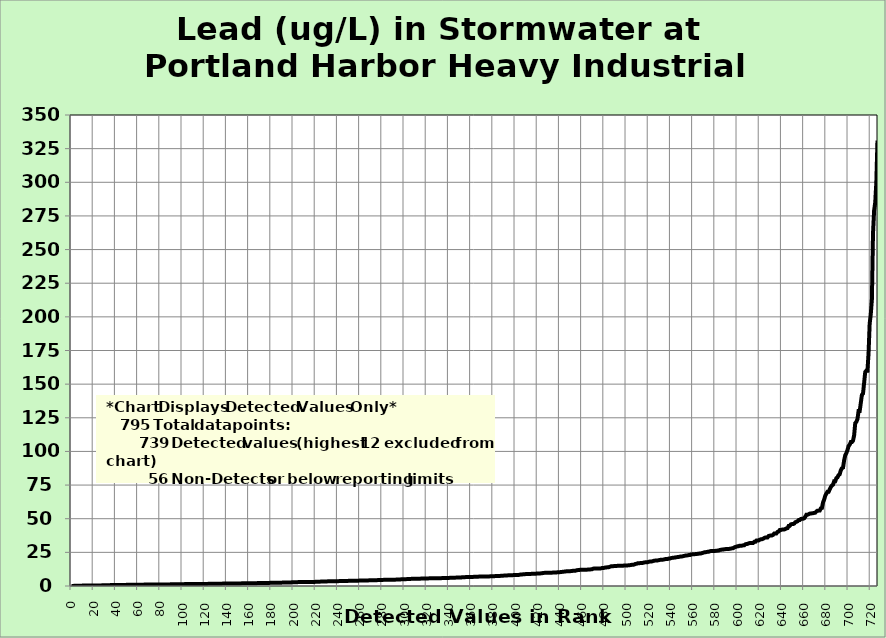
| Category | Lead |
|---|---|
| 0.0 | 0.011 |
| 1.0 | 0.014 |
| 2.0 | 0.115 |
| 3.0 | 0.137 |
| 4.0 | 0.178 |
| 5.0 | 0.24 |
| 6.0 | 0.246 |
| 7.0 | 0.25 |
| 8.0 | 0.256 |
| 9.0 | 0.256 |
| 10.0 | 0.3 |
| 11.0 | 0.31 |
| 12.0 | 0.339 |
| 13.0 | 0.34 |
| 14.0 | 0.341 |
| 15.0 | 0.358 |
| 16.0 | 0.374 |
| 17.0 | 0.397 |
| 18.0 | 0.4 |
| 19.0 | 0.41 |
| 20.0 | 0.41 |
| 21.0 | 0.422 |
| 22.0 | 0.43 |
| 23.0 | 0.433 |
| 24.0 | 0.444 |
| 25.0 | 0.452 |
| 26.0 | 0.456 |
| 27.0 | 0.464 |
| 28.0 | 0.488 |
| 29.0 | 0.49 |
| 30.0 | 0.52 |
| 31.0 | 0.528 |
| 32.0 | 0.533 |
| 33.0 | 0.611 |
| 34.0 | 0.616 |
| 35.0 | 0.66 |
| 36.0 | 0.678 |
| 37.0 | 0.678 |
| 38.0 | 0.682 |
| 39.0 | 0.71 |
| 40.0 | 0.72 |
| 41.0 | 0.721 |
| 42.0 | 0.73 |
| 43.0 | 0.744 |
| 44.0 | 0.756 |
| 45.0 | 0.767 |
| 46.0 | 0.774 |
| 47.0 | 0.81 |
| 48.0 | 0.81 |
| 49.0 | 0.833 |
| 50.0 | 0.867 |
| 51.0 | 0.878 |
| 52.0 | 0.89 |
| 53.0 | 0.9 |
| 54.0 | 0.9 |
| 55.0 | 0.9 |
| 56.0 | 0.932 |
| 57.0 | 0.933 |
| 58.0 | 0.967 |
| 59.0 | 0.971 |
| 60.0 | 0.98 |
| 61.0 | 0.99 |
| 62.0 | 0.992 |
| 63.0 | 1.01 |
| 64.0 | 1.02 |
| 65.0 | 1.02 |
| 66.0 | 1.05 |
| 67.0 | 1.05 |
| 68.0 | 1.07 |
| 69.0 | 1.08 |
| 70.0 | 1.08 |
| 71.0 | 1.08 |
| 72.0 | 1.08 |
| 73.0 | 1.08 |
| 74.0 | 1.08 |
| 75.0 | 1.1 |
| 76.0 | 1.12 |
| 77.0 | 1.13 |
| 78.0 | 1.13 |
| 79.0 | 1.14 |
| 80.0 | 1.16 |
| 81.0 | 1.2 |
| 82.0 | 1.2 |
| 83.0 | 1.2 |
| 84.0 | 1.2 |
| 85.0 | 1.2 |
| 86.0 | 1.2 |
| 87.0 | 1.2 |
| 88.0 | 1.2 |
| 89.0 | 1.21 |
| 90.0 | 1.22 |
| 91.0 | 1.24 |
| 92.0 | 1.25 |
| 93.0 | 1.27 |
| 94.0 | 1.29 |
| 95.0 | 1.3 |
| 96.0 | 1.3 |
| 97.0 | 1.33 |
| 98.0 | 1.34 |
| 99.0 | 1.34 |
| 100.0 | 1.38 |
| 101.0 | 1.38 |
| 102.0 | 1.4 |
| 103.0 | 1.4 |
| 104.0 | 1.4 |
| 105.0 | 1.41 |
| 106.0 | 1.42 |
| 107.0 | 1.42 |
| 108.0 | 1.42 |
| 109.0 | 1.44 |
| 110.0 | 1.44 |
| 111.0 | 1.46 |
| 112.0 | 1.49 |
| 113.0 | 1.5 |
| 114.0 | 1.5 |
| 115.0 | 1.5 |
| 116.0 | 1.5 |
| 117.0 | 1.52 |
| 118.0 | 1.53 |
| 119.0 | 1.53 |
| 120.0 | 1.56 |
| 121.0 | 1.57 |
| 122.0 | 1.57 |
| 123.0 | 1.58 |
| 124.0 | 1.58 |
| 125.0 | 1.6 |
| 126.0 | 1.6 |
| 127.0 | 1.6 |
| 128.0 | 1.65 |
| 129.0 | 1.67 |
| 130.0 | 1.67 |
| 131.0 | 1.7 |
| 132.0 | 1.7 |
| 133.0 | 1.7 |
| 134.0 | 1.72 |
| 135.0 | 1.73 |
| 136.0 | 1.77 |
| 137.0 | 1.78 |
| 138.0 | 1.78 |
| 139.0 | 1.8 |
| 140.0 | 1.82 |
| 141.0 | 1.82 |
| 142.0 | 1.83 |
| 143.0 | 1.84 |
| 144.0 | 1.87 |
| 145.0 | 1.87 |
| 146.0 | 1.88 |
| 147.0 | 1.89 |
| 148.0 | 1.9 |
| 149.0 | 1.9 |
| 150.0 | 1.9 |
| 151.0 | 1.9 |
| 152.0 | 1.9 |
| 153.0 | 1.95 |
| 154.0 | 1.96 |
| 155.0 | 1.97 |
| 156.0 | 1.97 |
| 157.0 | 2 |
| 158.0 | 2 |
| 159.0 | 2 |
| 160.0 | 2 |
| 161.0 | 2.04 |
| 162.0 | 2.08 |
| 163.0 | 2.08 |
| 164.0 | 2.1 |
| 165.0 | 2.11 |
| 166.0 | 2.12 |
| 167.0 | 2.13 |
| 168.0 | 2.16 |
| 169.0 | 2.2 |
| 170.0 | 2.2 |
| 171.0 | 2.2 |
| 172.0 | 2.21 |
| 173.0 | 2.23 |
| 174.0 | 2.26 |
| 175.0 | 2.26 |
| 176.0 | 2.3 |
| 177.0 | 2.3 |
| 178.0 | 2.31 |
| 179.0 | 2.33 |
| 180.0 | 2.33 |
| 181.0 | 2.33 |
| 182.0 | 2.34 |
| 183.0 | 2.4 |
| 184.0 | 2.4 |
| 185.0 | 2.4 |
| 186.0 | 2.42 |
| 187.0 | 2.49 |
| 188.0 | 2.5 |
| 189.0 | 2.5 |
| 190.0 | 2.51 |
| 191.0 | 2.52 |
| 192.0 | 2.55 |
| 193.0 | 2.56 |
| 194.0 | 2.56 |
| 195.0 | 2.59 |
| 196.0 | 2.6 |
| 197.0 | 2.6 |
| 198.0 | 2.69 |
| 199.0 | 2.78 |
| 200.0 | 2.78 |
| 201.0 | 2.79 |
| 202.0 | 2.8 |
| 203.0 | 2.8 |
| 204.0 | 2.89 |
| 205.0 | 2.9 |
| 206.0 | 2.9 |
| 207.0 | 2.9 |
| 208.0 | 2.91 |
| 209.0 | 2.93 |
| 210.0 | 2.94 |
| 211.0 | 2.96 |
| 212.0 | 2.96 |
| 213.0 | 2.97 |
| 214.0 | 2.98 |
| 215.0 | 2.99 |
| 216.0 | 2.99 |
| 217.0 | 3 |
| 218.0 | 3 |
| 219.0 | 3.01 |
| 220.0 | 3.18 |
| 221.0 | 3.2 |
| 222.0 | 3.2 |
| 223.0 | 3.24 |
| 224.0 | 3.24 |
| 225.0 | 3.29 |
| 226.0 | 3.36 |
| 227.0 | 3.36 |
| 228.0 | 3.39 |
| 229.0 | 3.4 |
| 230.0 | 3.42 |
| 231.0 | 3.45 |
| 232.0 | 3.46 |
| 233.0 | 3.47 |
| 234.0 | 3.5 |
| 235.0 | 3.5 |
| 236.0 | 3.5 |
| 237.0 | 3.54 |
| 238.0 | 3.57 |
| 239.0 | 3.57 |
| 240.0 | 3.6 |
| 241.0 | 3.63 |
| 242.0 | 3.7 |
| 243.0 | 3.71 |
| 244.0 | 3.72 |
| 245.0 | 3.73 |
| 246.0 | 3.74 |
| 247.0 | 3.74 |
| 248.0 | 3.8 |
| 249.0 | 3.8 |
| 250.0 | 3.87 |
| 251.0 | 3.88 |
| 252.0 | 3.9 |
| 253.0 | 3.9 |
| 254.0 | 3.9 |
| 255.0 | 3.9 |
| 256.0 | 3.93 |
| 257.0 | 3.96 |
| 258.0 | 3.97 |
| 259.0 | 4 |
| 260.0 | 4 |
| 261.0 | 4.02 |
| 262.0 | 4.05 |
| 263.0 | 4.06 |
| 264.0 | 4.1 |
| 265.0 | 4.1 |
| 266.0 | 4.11 |
| 267.0 | 4.14 |
| 268.0 | 4.2 |
| 269.0 | 4.25 |
| 270.0 | 4.26 |
| 271.0 | 4.26 |
| 272.0 | 4.3 |
| 273.0 | 4.31 |
| 274.0 | 4.33 |
| 275.0 | 4.35 |
| 276.0 | 4.38 |
| 277.0 | 4.38 |
| 278.0 | 4.4 |
| 279.0 | 4.43 |
| 280.0 | 4.5 |
| 281.0 | 4.56 |
| 282.0 | 4.57 |
| 283.0 | 4.58 |
| 284.0 | 4.6 |
| 285.0 | 4.6 |
| 286.0 | 4.6 |
| 287.0 | 4.65 |
| 288.0 | 4.66 |
| 289.0 | 4.68 |
| 290.0 | 4.68 |
| 291.0 | 4.69 |
| 292.0 | 4.73 |
| 293.0 | 4.8 |
| 294.0 | 4.8 |
| 295.0 | 4.83 |
| 296.0 | 4.85 |
| 297.0 | 4.98 |
| 298.0 | 5 |
| 299.0 | 5.03 |
| 300.0 | 5.07 |
| 301.0 | 5.1 |
| 302.0 | 5.11 |
| 303.0 | 5.2 |
| 304.0 | 5.22 |
| 305.0 | 5.26 |
| 306.0 | 5.3 |
| 307.0 | 5.31 |
| 308.0 | 5.38 |
| 309.0 | 5.38 |
| 310.0 | 5.4 |
| 311.0 | 5.4 |
| 312.0 | 5.4 |
| 313.0 | 5.41 |
| 314.0 | 5.44 |
| 315.0 | 5.51 |
| 316.0 | 5.55 |
| 317.0 | 5.58 |
| 318.0 | 5.6 |
| 319.0 | 5.6 |
| 320.0 | 5.62 |
| 321.0 | 5.64 |
| 322.0 | 5.67 |
| 323.0 | 5.7 |
| 324.0 | 5.7 |
| 325.0 | 5.7 |
| 326.0 | 5.7 |
| 327.0 | 5.71 |
| 328.0 | 5.74 |
| 329.0 | 5.8 |
| 330.0 | 5.8 |
| 331.0 | 5.81 |
| 332.0 | 5.83 |
| 333.0 | 5.83 |
| 334.0 | 5.89 |
| 335.0 | 5.9 |
| 336.0 | 5.93 |
| 337.0 | 5.93 |
| 338.0 | 5.93 |
| 339.0 | 5.96 |
| 340.0 | 6 |
| 341.0 | 6.1 |
| 342.0 | 6.11 |
| 343.0 | 6.13 |
| 344.0 | 6.15 |
| 345.0 | 6.19 |
| 346.0 | 6.22 |
| 347.0 | 6.26 |
| 348.0 | 6.27 |
| 349.0 | 6.29 |
| 350.0 | 6.29 |
| 351.0 | 6.3 |
| 352.0 | 6.56 |
| 353.0 | 6.56 |
| 354.0 | 6.57 |
| 355.0 | 6.6 |
| 356.0 | 6.6 |
| 357.0 | 6.6 |
| 358.0 | 6.6 |
| 359.0 | 6.66 |
| 360.0 | 6.66 |
| 361.0 | 6.7 |
| 362.0 | 6.78 |
| 363.0 | 6.8 |
| 364.0 | 6.87 |
| 365.0 | 6.9 |
| 366.0 | 6.92 |
| 367.0 | 6.99 |
| 368.0 | 6.99 |
| 369.0 | 7 |
| 370.0 | 7 |
| 371.0 | 7.01 |
| 372.0 | 7.01 |
| 373.0 | 7.02 |
| 374.0 | 7.02 |
| 375.0 | 7.03 |
| 376.0 | 7.05 |
| 377.0 | 7.22 |
| 378.0 | 7.26 |
| 379.0 | 7.26 |
| 380.0 | 7.28 |
| 381.0 | 7.3 |
| 382.0 | 7.4 |
| 383.0 | 7.43 |
| 384.0 | 7.43 |
| 385.0 | 7.49 |
| 386.0 | 7.5 |
| 387.0 | 7.6 |
| 388.0 | 7.62 |
| 389.0 | 7.68 |
| 390.0 | 7.79 |
| 391.0 | 7.8 |
| 392.0 | 7.86 |
| 393.0 | 7.9 |
| 394.0 | 7.99 |
| 395.0 | 8 |
| 396.0 | 8.01 |
| 397.0 | 8.04 |
| 398.0 | 8.1 |
| 399.0 | 8.1 |
| 400.0 | 8.13 |
| 401.0 | 8.2 |
| 402.0 | 8.2 |
| 403.0 | 8.23 |
| 404.0 | 8.47 |
| 405.0 | 8.6 |
| 406.0 | 8.6 |
| 407.0 | 8.7 |
| 408.0 | 8.72 |
| 409.0 | 8.84 |
| 410.0 | 8.96 |
| 411.0 | 9 |
| 412.0 | 9 |
| 413.0 | 9 |
| 414.0 | 9 |
| 415.0 | 9.08 |
| 416.0 | 9.1 |
| 417.0 | 9.1 |
| 418.0 | 9.1 |
| 419.0 | 9.26 |
| 420.0 | 9.27 |
| 421.0 | 9.34 |
| 422.0 | 9.35 |
| 423.0 | 9.4 |
| 424.0 | 9.5 |
| 425.0 | 9.73 |
| 426.0 | 9.76 |
| 427.0 | 9.8 |
| 428.0 | 9.8 |
| 429.0 | 9.8 |
| 430.0 | 9.9 |
| 431.0 | 9.9 |
| 432.0 | 9.93 |
| 433.0 | 9.93 |
| 434.0 | 10 |
| 435.0 | 10 |
| 436.0 | 10.1 |
| 437.0 | 10.1 |
| 438.0 | 10.2 |
| 439.0 | 10.3 |
| 440.0 | 10.3 |
| 441.0 | 10.4 |
| 442.0 | 10.5 |
| 443.0 | 10.6 |
| 444.0 | 10.7 |
| 445.0 | 10.8 |
| 446.0 | 11 |
| 447.0 | 11 |
| 448.0 | 11 |
| 449.0 | 11 |
| 450.0 | 11.1 |
| 451.0 | 11.2 |
| 452.0 | 11.4 |
| 453.0 | 11.4 |
| 454.0 | 11.4 |
| 455.0 | 11.7 |
| 456.0 | 11.8 |
| 457.0 | 11.8 |
| 458.0 | 12 |
| 459.0 | 12 |
| 460.0 | 12 |
| 461.0 | 12 |
| 462.0 | 12.1 |
| 463.0 | 12.1 |
| 464.0 | 12.1 |
| 465.0 | 12.2 |
| 466.0 | 12.2 |
| 467.0 | 12.3 |
| 468.0 | 12.4 |
| 469.0 | 12.5 |
| 470.0 | 12.9 |
| 471.0 | 13 |
| 472.0 | 13 |
| 473.0 | 13 |
| 474.0 | 13 |
| 475.0 | 13 |
| 476.0 | 13 |
| 477.0 | 13.1 |
| 478.0 | 13.4 |
| 479.0 | 13.4 |
| 480.0 | 13.5 |
| 481.0 | 13.8 |
| 482.0 | 13.8 |
| 483.0 | 14 |
| 484.0 | 14 |
| 485.0 | 14.3 |
| 486.0 | 14.6 |
| 487.0 | 14.6 |
| 488.0 | 14.7 |
| 489.0 | 14.9 |
| 490.0 | 14.9 |
| 491.0 | 14.9 |
| 492.0 | 15 |
| 493.0 | 15 |
| 494.0 | 15 |
| 495.0 | 15 |
| 496.0 | 15 |
| 497.0 | 15.1 |
| 498.0 | 15.3 |
| 499.0 | 15.3 |
| 500.0 | 15.3 |
| 501.0 | 15.3 |
| 502.0 | 15.4 |
| 503.0 | 15.5 |
| 504.0 | 15.6 |
| 505.0 | 15.8 |
| 506.0 | 15.8 |
| 507.0 | 16 |
| 508.0 | 16.4 |
| 509.0 | 16.5 |
| 510.0 | 16.9 |
| 511.0 | 16.9 |
| 512.0 | 17 |
| 513.0 | 17 |
| 514.0 | 17 |
| 515.0 | 17.3 |
| 516.0 | 17.5 |
| 517.0 | 17.6 |
| 518.0 | 17.7 |
| 519.0 | 17.7 |
| 520.0 | 18 |
| 521.0 | 18.2 |
| 522.0 | 18.2 |
| 523.0 | 18.3 |
| 524.0 | 18.6 |
| 525.0 | 18.8 |
| 526.0 | 18.9 |
| 527.0 | 19 |
| 528.0 | 19 |
| 529.0 | 19.2 |
| 530.0 | 19.4 |
| 531.0 | 19.5 |
| 532.0 | 19.5 |
| 533.0 | 19.6 |
| 534.0 | 19.8 |
| 535.0 | 20 |
| 536.0 | 20 |
| 537.0 | 20.1 |
| 538.0 | 20.4 |
| 539.0 | 20.4 |
| 540.0 | 20.7 |
| 541.0 | 20.9 |
| 542.0 | 21 |
| 543.0 | 21.1 |
| 544.0 | 21.2 |
| 545.0 | 21.4 |
| 546.0 | 21.5 |
| 547.0 | 21.6 |
| 548.0 | 21.8 |
| 549.0 | 22 |
| 550.0 | 22 |
| 551.0 | 22.2 |
| 552.0 | 22.4 |
| 553.0 | 22.6 |
| 554.0 | 22.6 |
| 555.0 | 22.8 |
| 556.0 | 23 |
| 557.0 | 23 |
| 558.0 | 23.4 |
| 559.0 | 23.5 |
| 560.0 | 23.6 |
| 561.0 | 23.6 |
| 562.0 | 23.7 |
| 563.0 | 23.8 |
| 564.0 | 23.9 |
| 565.0 | 24 |
| 566.0 | 24.2 |
| 567.0 | 24.2 |
| 568.0 | 24.5 |
| 569.0 | 24.7 |
| 570.0 | 25 |
| 571.0 | 25 |
| 572.0 | 25.3 |
| 573.0 | 25.4 |
| 574.0 | 25.5 |
| 575.0 | 25.8 |
| 576.0 | 26 |
| 577.0 | 26 |
| 578.0 | 26 |
| 579.0 | 26 |
| 580.0 | 26.1 |
| 581.0 | 26.2 |
| 582.0 | 26.3 |
| 583.0 | 26.4 |
| 584.0 | 26.8 |
| 585.0 | 26.9 |
| 586.0 | 27.1 |
| 587.0 | 27.1 |
| 588.0 | 27.3 |
| 589.0 | 27.4 |
| 590.0 | 27.5 |
| 591.0 | 27.5 |
| 592.0 | 27.5 |
| 593.0 | 27.7 |
| 594.0 | 27.8 |
| 595.0 | 28 |
| 596.0 | 28.1 |
| 597.0 | 28.7 |
| 598.0 | 29 |
| 599.0 | 29.2 |
| 600.0 | 29.6 |
| 601.0 | 29.6 |
| 602.0 | 30 |
| 603.0 | 30 |
| 604.0 | 30 |
| 605.0 | 30.2 |
| 606.0 | 30.2 |
| 607.0 | 31 |
| 608.0 | 31.2 |
| 609.0 | 31.3 |
| 610.0 | 31.7 |
| 611.0 | 31.9 |
| 612.0 | 31.9 |
| 613.0 | 32 |
| 614.0 | 32 |
| 615.0 | 32.8 |
| 616.0 | 32.8 |
| 617.0 | 33.8 |
| 618.0 | 33.9 |
| 619.0 | 33.9 |
| 620.0 | 34.4 |
| 621.0 | 34.7 |
| 622.0 | 34.8 |
| 623.0 | 35.1 |
| 624.0 | 35.7 |
| 625.0 | 36 |
| 626.0 | 36.1 |
| 627.0 | 36.1 |
| 628.0 | 37.2 |
| 629.0 | 37.4 |
| 630.0 | 37.6 |
| 631.0 | 37.6 |
| 632.0 | 38 |
| 633.0 | 39 |
| 634.0 | 39.1 |
| 635.0 | 39.1 |
| 636.0 | 40.2 |
| 637.0 | 40.5 |
| 638.0 | 41.6 |
| 639.0 | 41.6 |
| 640.0 | 41.9 |
| 641.0 | 42 |
| 642.0 | 42 |
| 643.0 | 42.4 |
| 644.0 | 42.8 |
| 645.0 | 43 |
| 646.0 | 44.6 |
| 647.0 | 44.7 |
| 648.0 | 45.8 |
| 649.0 | 46 |
| 650.0 | 46 |
| 651.0 | 46.4 |
| 652.0 | 47.4 |
| 653.0 | 47.7 |
| 654.0 | 48.1 |
| 655.0 | 49 |
| 656.0 | 49 |
| 657.0 | 49.8 |
| 658.0 | 50 |
| 659.0 | 50 |
| 660.0 | 50.3 |
| 661.0 | 51.5 |
| 662.0 | 53 |
| 663.0 | 53 |
| 664.0 | 53.3 |
| 665.0 | 53.8 |
| 666.0 | 53.9 |
| 667.0 | 54 |
| 668.0 | 54.1 |
| 669.0 | 54.3 |
| 670.0 | 54.5 |
| 671.0 | 55.4 |
| 672.0 | 56 |
| 673.0 | 56 |
| 674.0 | 56.1 |
| 675.0 | 57.7 |
| 676.0 | 58 |
| 677.0 | 62.1 |
| 678.0 | 64.2 |
| 679.0 | 67.1 |
| 680.0 | 68.7 |
| 681.0 | 70 |
| 682.0 | 70 |
| 683.0 | 71.8 |
| 684.0 | 73.6 |
| 685.0 | 74.7 |
| 686.0 | 75.3 |
| 687.0 | 77.9 |
| 688.0 | 77.9 |
| 689.0 | 80.2 |
| 690.0 | 80.7 |
| 691.0 | 82.4 |
| 692.0 | 83 |
| 693.0 | 86 |
| 694.0 | 87.5 |
| 695.0 | 88 |
| 696.0 | 93.4 |
| 697.0 | 97.2 |
| 698.0 | 98.7 |
| 699.0 | 101 |
| 700.0 | 104 |
| 701.0 | 105 |
| 702.0 | 107 |
| 703.0 | 107 |
| 704.0 | 108 |
| 705.0 | 112 |
| 706.0 | 121 |
| 707.0 | 122 |
| 708.0 | 124 |
| 709.0 | 130 |
| 710.0 | 130 |
| 711.0 | 136 |
| 712.0 | 142 |
| 713.0 | 143 |
| 714.0 | 151 |
| 715.0 | 159 |
| 716.0 | 160 |
| 717.0 | 160 |
| 718.0 | 173 |
| 719.0 | 195 |
| 720.0 | 202 |
| 721.0 | 213 |
| 722.0 | 262 |
| 723.0 | 279 |
| 724.0 | 285 |
| 725.0 | 300 |
| 726.0 | 331 |